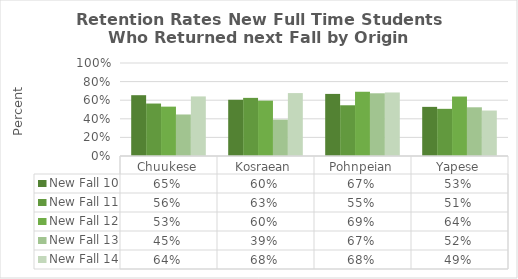
| Category | New Fall 10 | New Fall 11 | New Fall 12 | New Fall 13 | New Fall 14 |
|---|---|---|---|---|---|
| Chuukese | 0.654 | 0.564 | 0.531 | 0.446 | 0.641 |
| Kosraean | 0.605 | 0.625 | 0.595 | 0.391 | 0.676 |
| Pohnpeian | 0.668 | 0.545 | 0.691 | 0.674 | 0.683 |
| Yapese | 0.528 | 0.507 | 0.639 | 0.524 | 0.489 |